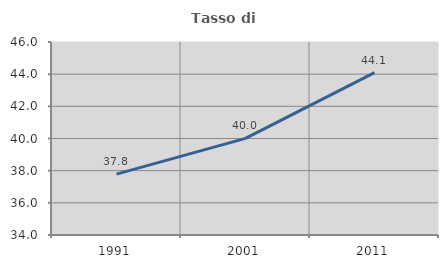
| Category | Tasso di occupazione   |
|---|---|
| 1991.0 | 37.785 |
| 2001.0 | 40.007 |
| 2011.0 | 44.094 |